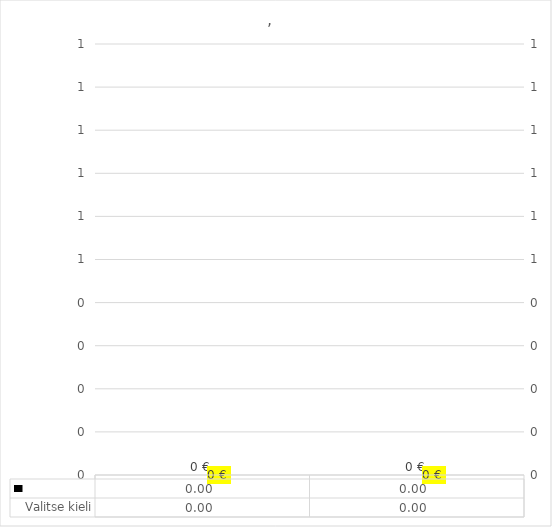
| Category | Series 2 |
|---|---|
| 0 | 0 |
| 1 | 0 |